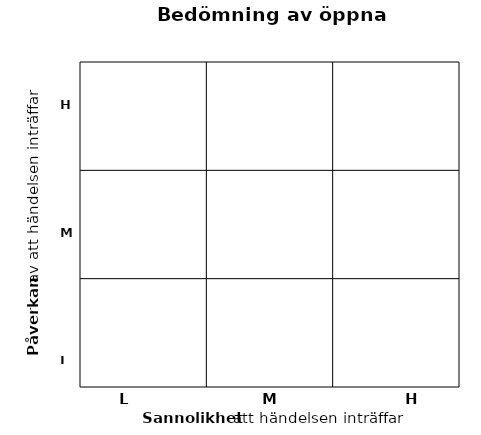
| Category | Risk |
|---|---|
| 3.0 | 3 |
| 3.0 | 2 |
| 3.0 | 1 |
| 2.0 | 3 |
| 2.0 | 2 |
| 2.0 | 1 |
| 1.0 | 3 |
| 1.0 | 2 |
| 1.0 | 1 |